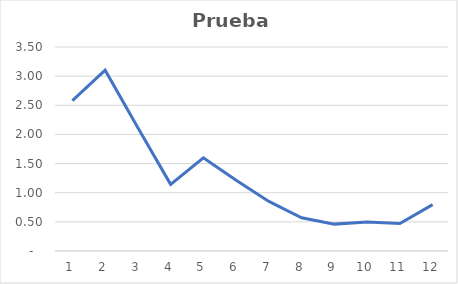
| Category | Series 0 |
|---|---|
| 0 | 2.581 |
| 1 | 3.102 |
| 2 | 2.116 |
| 3 | 1.143 |
| 4 | 1.599 |
| 5 | 1.215 |
| 6 | 0.851 |
| 7 | 0.57 |
| 8 | 0.461 |
| 9 | 0.5 |
| 10 | 0.472 |
| 11 | 0.796 |